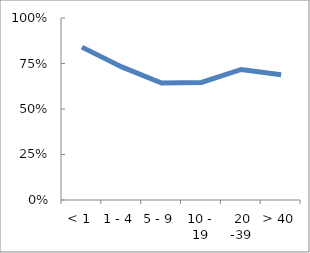
| Category | propn using net |
|---|---|
| < 1 | 0.84 |
| 1 - 4 | 0.731 |
| 5 - 9 | 0.643 |
| 10 - 19 | 0.646 |
|  20 -39 | 0.717 |
| > 40 | 0.688 |